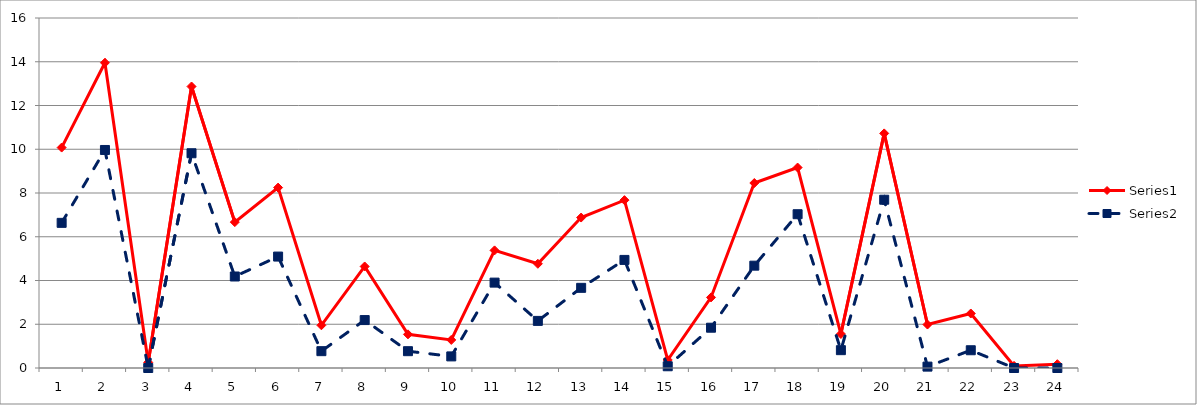
| Category | Series 0 | Series 1 |
|---|---|---|
| 0 | 10.077 | 6.635 |
| 1 | 13.954 | 9.967 |
| 2 | 0.255 | 0 |
| 3 | 12.868 | 9.817 |
| 4 | 6.669 | 4.183 |
| 5 | 8.247 | 5.094 |
| 6 | 1.952 | 0.77 |
| 7 | 4.641 | 2.191 |
| 8 | 1.539 | 0.769 |
| 9 | 1.283 | 0.53 |
| 10 | 5.377 | 3.903 |
| 11 | 4.764 | 2.153 |
| 12 | 6.878 | 3.664 |
| 13 | 7.673 | 4.941 |
| 14 | 0.366 | 0.08 |
| 15 | 3.227 | 1.842 |
| 16 | 8.456 | 4.678 |
| 17 | 9.163 | 7.03 |
| 18 | 1.554 | 0.815 |
| 19 | 10.725 | 7.692 |
| 20 | 1.987 | 0.063 |
| 21 | 2.491 | 0.812 |
| 22 | 0.097 | 0 |
| 23 | 0.174 | 0 |